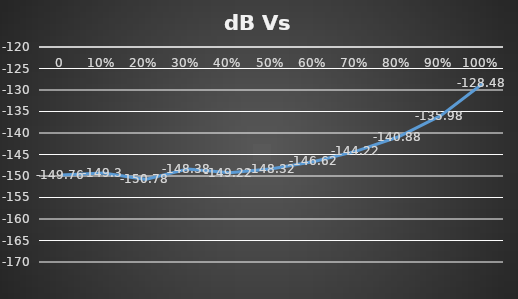
| Category | Series 0 |
|---|---|
| 0.0 | -149.76 |
| 0.1 | -149.3 |
| 0.2 | -150.78 |
| 0.3 | -148.38 |
| 0.4 | -149.22 |
| 0.5 | -148.32 |
| 0.6 | -146.62 |
| 0.7 | -144.22 |
| 0.8 | -140.88 |
| 0.9 | -135.98 |
| 1.0 | -128.48 |